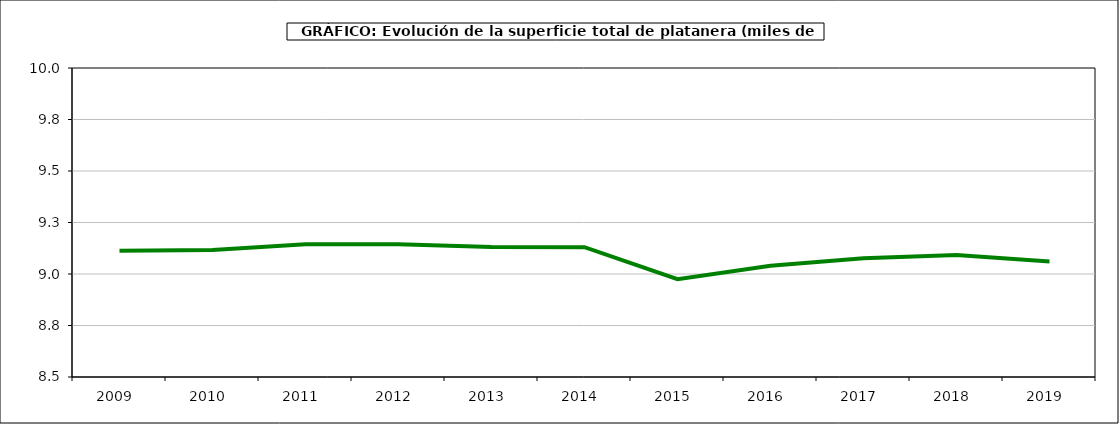
| Category | superficie platanera |
|---|---|
| 2009.0 | 9.113 |
| 2010.0 | 9.117 |
| 2011.0 | 9.144 |
| 2012.0 | 9.144 |
| 2013.0 | 9.131 |
| 2014.0 | 9.13 |
| 2015.0 | 8.975 |
| 2016.0 | 9.04 |
| 2017.0 | 9.076 |
| 2018.0 | 9.092 |
| 2019.0 | 9.061 |